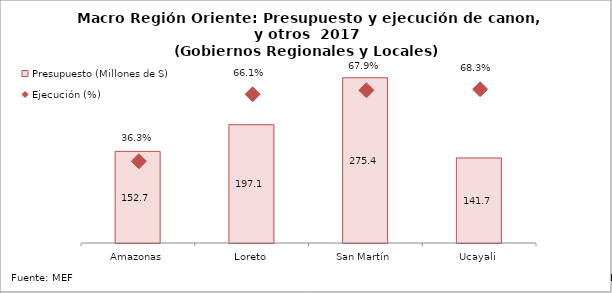
| Category | Presupuesto (Millones de S) |
|---|---|
| Amazonas | 152.706 |
| Loreto | 197.135 |
| San Martín | 275.435 |
| Ucayali | 141.712 |